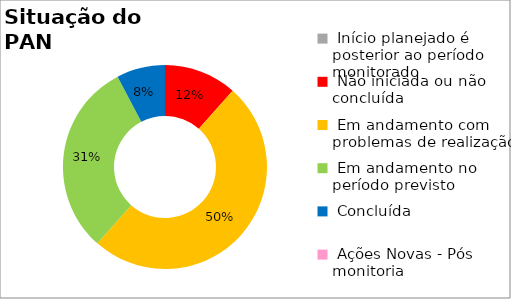
| Category | Series 0 |
|---|---|
|  Início planejado é posterior ao período monitorado | 0 |
|  Não iniciada ou não concluída | 0.115 |
|  Em andamento com problemas de realização | 0.5 |
|  Em andamento no período previsto  | 0.308 |
|  Concluída | 0.077 |
|  Ações Novas - Pós monitoria | 0 |